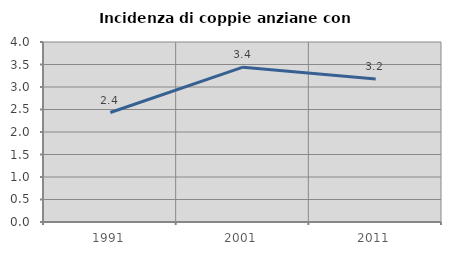
| Category | Incidenza di coppie anziane con figli |
|---|---|
| 1991.0 | 2.433 |
| 2001.0 | 3.441 |
| 2011.0 | 3.177 |